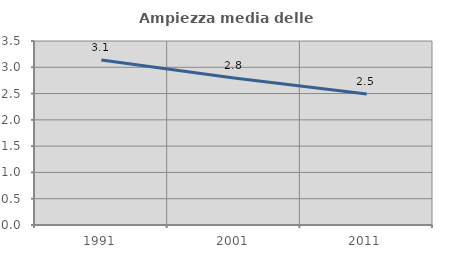
| Category | Ampiezza media delle famiglie |
|---|---|
| 1991.0 | 3.141 |
| 2001.0 | 2.797 |
| 2011.0 | 2.49 |